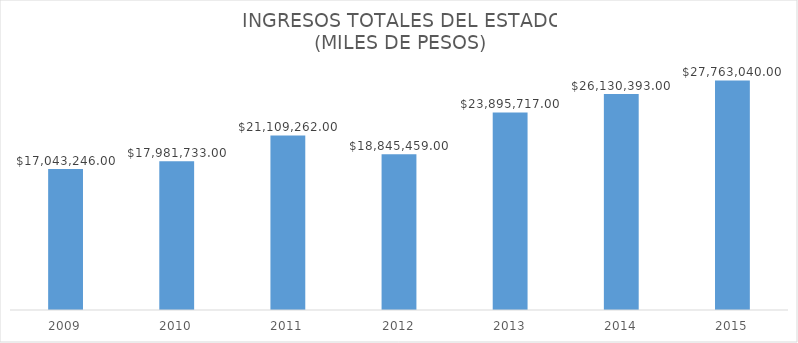
| Category | MONTO |
|---|---|
| 2009.0 | 17043246 |
| 2010.0 | 17981733 |
| 2011.0 | 21109262 |
| 2012.0 | 18845459 |
| 2013.0 | 23895717 |
| 2014.0 | 26130393 |
| 2015.0 | 27763040 |